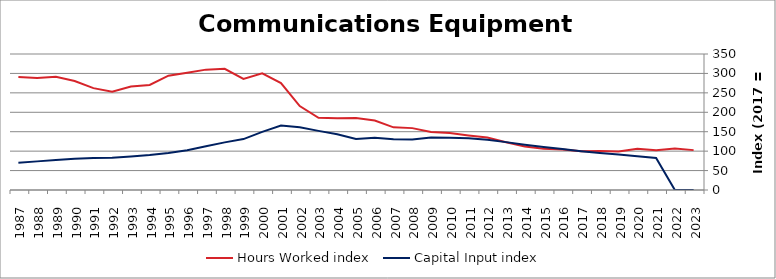
| Category | Hours Worked index | Capital Input index |
|---|---|---|
| 2023.0 | 102.628 | 0 |
| 2022.0 | 106.912 | 0 |
| 2021.0 | 102.597 | 82.438 |
| 2020.0 | 106.431 | 86.889 |
| 2019.0 | 99.379 | 91.359 |
| 2018.0 | 100.337 | 95.244 |
| 2017.0 | 100 | 100 |
| 2016.0 | 104.094 | 105.51 |
| 2015.0 | 106.099 | 110.733 |
| 2014.0 | 111.726 | 116.53 |
| 2013.0 | 122.994 | 123.228 |
| 2012.0 | 135.12 | 129.187 |
| 2011.0 | 140.44 | 133.265 |
| 2010.0 | 146.725 | 134.4 |
| 2009.0 | 149.397 | 134.856 |
| 2008.0 | 159.241 | 130.142 |
| 2007.0 | 161.205 | 130.798 |
| 2006.0 | 178.662 | 134.306 |
| 2005.0 | 185.218 | 131.084 |
| 2004.0 | 184.567 | 143.29 |
| 2003.0 | 185.618 | 152.179 |
| 2002.0 | 215.93 | 161.391 |
| 2001.0 | 274.976 | 165.964 |
| 2000.0 | 300.035 | 149.642 |
| 1999.0 | 285.829 | 131.093 |
| 1998.0 | 311.795 | 122.563 |
| 1997.0 | 309.775 | 112.733 |
| 1996.0 | 301.707 | 102.356 |
| 1995.0 | 294.11 | 95.252 |
| 1994.0 | 270.273 | 90.024 |
| 1993.0 | 266.552 | 85.957 |
| 1992.0 | 253.134 | 82.851 |
| 1991.0 | 262.202 | 82.289 |
| 1990.0 | 280.492 | 80.594 |
| 1989.0 | 291.552 | 77.292 |
| 1988.0 | 287.936 | 73.674 |
| 1987.0 | 290.682 | 70.366 |